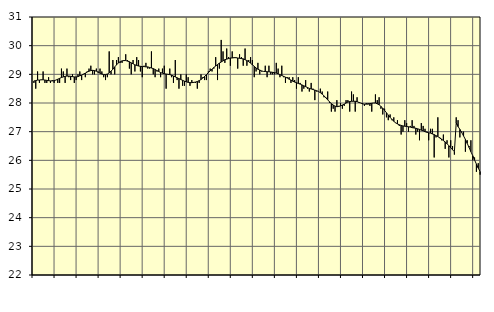
| Category | Piggar | Series 1 |
|---|---|---|
| nan | 28.7 | 28.77 |
| 1.0 | 28.5 | 28.78 |
| 1.0 | 29.1 | 28.8 |
| 1.0 | 28.7 | 28.8 |
| 1.0 | 28.8 | 28.81 |
| 1.0 | 29.1 | 28.81 |
| 1.0 | 28.7 | 28.8 |
| 1.0 | 28.7 | 28.79 |
| 1.0 | 28.9 | 28.78 |
| 1.0 | 28.7 | 28.77 |
| 1.0 | 28.8 | 28.77 |
| 1.0 | 28.7 | 28.78 |
| nan | 28.8 | 28.8 |
| 2.0 | 28.7 | 28.83 |
| 2.0 | 28.7 | 28.86 |
| 2.0 | 29.2 | 28.89 |
| 2.0 | 29.1 | 28.91 |
| 2.0 | 28.7 | 28.93 |
| 2.0 | 29.2 | 28.94 |
| 2.0 | 28.9 | 28.94 |
| 2.0 | 28.8 | 28.93 |
| 2.0 | 29 | 28.92 |
| 2.0 | 28.7 | 28.91 |
| 2.0 | 28.8 | 28.91 |
| nan | 29 | 28.92 |
| 3.0 | 29.1 | 28.95 |
| 3.0 | 28.8 | 28.97 |
| 3.0 | 29 | 29.01 |
| 3.0 | 28.9 | 29.04 |
| 3.0 | 29.1 | 29.08 |
| 3.0 | 29.2 | 29.11 |
| 3.0 | 29.3 | 29.13 |
| 3.0 | 29 | 29.14 |
| 3.0 | 29 | 29.13 |
| 3.0 | 29.2 | 29.11 |
| 3.0 | 29.1 | 29.07 |
| nan | 29.2 | 29.04 |
| 4.0 | 29.1 | 29.01 |
| 4.0 | 28.9 | 28.99 |
| 4.0 | 28.8 | 28.99 |
| 4.0 | 28.9 | 29.01 |
| 4.0 | 29.8 | 29.05 |
| 4.0 | 29 | 29.11 |
| 4.0 | 29.5 | 29.18 |
| 4.0 | 29 | 29.26 |
| 4.0 | 29.5 | 29.33 |
| 4.0 | 29.6 | 29.4 |
| 4.0 | 29.4 | 29.44 |
| nan | 29.4 | 29.47 |
| 5.0 | 29.5 | 29.48 |
| 5.0 | 29.7 | 29.48 |
| 5.0 | 29.5 | 29.46 |
| 5.0 | 29.2 | 29.44 |
| 5.0 | 29 | 29.4 |
| 5.0 | 29.5 | 29.37 |
| 5.0 | 29.1 | 29.33 |
| 5.0 | 29.6 | 29.31 |
| 5.0 | 29.5 | 29.29 |
| 5.0 | 29.1 | 29.28 |
| 5.0 | 28.9 | 29.27 |
| nan | 29.3 | 29.27 |
| 6.0 | 29.4 | 29.26 |
| 6.0 | 29.2 | 29.26 |
| 6.0 | 29.2 | 29.24 |
| 6.0 | 29.8 | 29.22 |
| 6.0 | 29 | 29.2 |
| 6.0 | 28.9 | 29.17 |
| 6.0 | 29.1 | 29.13 |
| 6.0 | 29.2 | 29.1 |
| 6.0 | 28.9 | 29.06 |
| 6.0 | 29.2 | 29.04 |
| 6.0 | 29.3 | 29.02 |
| nan | 28.5 | 29.01 |
| 7.0 | 29 | 29 |
| 7.0 | 29.2 | 28.99 |
| 7.0 | 28.9 | 28.97 |
| 7.0 | 28.7 | 28.94 |
| 7.0 | 29.5 | 28.91 |
| 7.0 | 28.8 | 28.88 |
| 7.0 | 28.5 | 28.85 |
| 7.0 | 29 | 28.82 |
| 7.0 | 28.6 | 28.79 |
| 7.0 | 28.6 | 28.76 |
| 7.0 | 29 | 28.74 |
| nan | 28.9 | 28.72 |
| 8.0 | 28.6 | 28.71 |
| 8.0 | 28.8 | 28.71 |
| 8.0 | 28.7 | 28.72 |
| 8.0 | 28.7 | 28.73 |
| 8.0 | 28.5 | 28.75 |
| 8.0 | 28.7 | 28.78 |
| 8.0 | 29 | 28.82 |
| 8.0 | 28.9 | 28.87 |
| 8.0 | 28.8 | 28.93 |
| 8.0 | 28.8 | 28.99 |
| 8.0 | 29.1 | 29.06 |
| nan | 29.2 | 29.12 |
| 9.0 | 29.1 | 29.18 |
| 9.0 | 29.2 | 29.24 |
| 9.0 | 29.6 | 29.29 |
| 9.0 | 28.8 | 29.34 |
| 9.0 | 29.2 | 29.39 |
| 9.0 | 30.2 | 29.43 |
| 9.0 | 29.8 | 29.47 |
| 9.0 | 29.4 | 29.51 |
| 9.0 | 29.9 | 29.53 |
| 9.0 | 29.6 | 29.55 |
| 9.0 | 29.3 | 29.57 |
| nan | 29.8 | 29.57 |
| 10.0 | 29.6 | 29.58 |
| 10.0 | 29.6 | 29.58 |
| 10.0 | 29.2 | 29.57 |
| 10.0 | 29.7 | 29.56 |
| 10.0 | 29.6 | 29.55 |
| 10.0 | 29.3 | 29.54 |
| 10.0 | 29.9 | 29.51 |
| 10.0 | 29.3 | 29.48 |
| 10.0 | 29.5 | 29.44 |
| 10.0 | 29.6 | 29.39 |
| 10.0 | 29.5 | 29.33 |
| nan | 28.9 | 29.28 |
| 11.0 | 29.1 | 29.22 |
| 11.0 | 29.4 | 29.18 |
| 11.0 | 29 | 29.15 |
| 11.0 | 29.1 | 29.12 |
| 11.0 | 29.1 | 29.1 |
| 11.0 | 29.3 | 29.1 |
| 11.0 | 28.9 | 29.09 |
| 11.0 | 29.3 | 29.09 |
| 11.0 | 29 | 29.08 |
| 11.0 | 29 | 29.07 |
| 11.0 | 29 | 29.06 |
| nan | 29.4 | 29.04 |
| 12.0 | 29.2 | 29.02 |
| 12.0 | 28.9 | 28.99 |
| 12.0 | 29.3 | 28.96 |
| 12.0 | 28.9 | 28.93 |
| 12.0 | 28.7 | 28.9 |
| 12.0 | 28.9 | 28.87 |
| 12.0 | 28.9 | 28.83 |
| 12.0 | 28.7 | 28.8 |
| 12.0 | 28.9 | 28.76 |
| 12.0 | 28.8 | 28.73 |
| 12.0 | 28.5 | 28.71 |
| nan | 28.9 | 28.68 |
| 13.0 | 28.7 | 28.66 |
| 13.0 | 28.4 | 28.63 |
| 13.0 | 28.5 | 28.6 |
| 13.0 | 28.8 | 28.57 |
| 13.0 | 28.5 | 28.54 |
| 13.0 | 28.4 | 28.51 |
| 13.0 | 28.7 | 28.49 |
| 13.0 | 28.5 | 28.47 |
| 13.0 | 28.1 | 28.45 |
| 13.0 | 28.4 | 28.43 |
| 13.0 | 28.4 | 28.4 |
| nan | 28.5 | 28.36 |
| 14.0 | 28.4 | 28.31 |
| 14.0 | 28.2 | 28.25 |
| 14.0 | 28.2 | 28.18 |
| 14.0 | 28.4 | 28.11 |
| 14.0 | 28 | 28.04 |
| 14.0 | 27.7 | 27.98 |
| 14.0 | 27.8 | 27.93 |
| 14.0 | 27.7 | 27.89 |
| 14.0 | 28.1 | 27.87 |
| 14.0 | 27.9 | 27.88 |
| 14.0 | 28 | 27.9 |
| nan | 27.8 | 27.93 |
| 15.0 | 27.9 | 27.96 |
| 15.0 | 28.1 | 28 |
| 15.0 | 28.1 | 28.03 |
| 15.0 | 27.7 | 28.05 |
| 15.0 | 28.4 | 28.06 |
| 15.0 | 28.3 | 28.06 |
| 15.0 | 27.7 | 28.06 |
| 15.0 | 28.2 | 28.05 |
| 15.0 | 28 | 28.02 |
| 15.0 | 28 | 28 |
| 15.0 | 28 | 27.97 |
| nan | 27.9 | 27.96 |
| 16.0 | 28 | 27.96 |
| 16.0 | 28 | 27.96 |
| 16.0 | 27.9 | 27.98 |
| 16.0 | 27.7 | 27.99 |
| 16.0 | 28 | 28 |
| 16.0 | 28.3 | 28 |
| 16.0 | 28.1 | 27.97 |
| 16.0 | 28.2 | 27.94 |
| 16.0 | 27.8 | 27.88 |
| 16.0 | 27.6 | 27.82 |
| 16.0 | 27.8 | 27.74 |
| nan | 27.5 | 27.66 |
| 17.0 | 27.4 | 27.58 |
| 17.0 | 27.6 | 27.5 |
| 17.0 | 27.4 | 27.43 |
| 17.0 | 27.5 | 27.36 |
| 17.0 | 27.3 | 27.31 |
| 17.0 | 27.4 | 27.27 |
| 17.0 | 27.2 | 27.24 |
| 17.0 | 26.9 | 27.22 |
| 17.0 | 27 | 27.2 |
| 17.0 | 27.4 | 27.19 |
| 17.0 | 27.3 | 27.18 |
| nan | 27 | 27.17 |
| 18.0 | 27.2 | 27.16 |
| 18.0 | 27.4 | 27.14 |
| 18.0 | 27.2 | 27.13 |
| 18.0 | 26.9 | 27.12 |
| 18.0 | 27 | 27.1 |
| 18.0 | 26.7 | 27.08 |
| 18.0 | 27.3 | 27.05 |
| 18.0 | 27.2 | 27.03 |
| 18.0 | 27.1 | 27 |
| 18.0 | 27 | 26.98 |
| 18.0 | 26.7 | 26.96 |
| nan | 27.1 | 26.95 |
| 19.0 | 27.1 | 26.92 |
| 19.0 | 26.1 | 26.9 |
| 19.0 | 26.8 | 26.86 |
| 19.0 | 27.5 | 26.83 |
| 19.0 | 26.8 | 26.78 |
| 19.0 | 26.7 | 26.74 |
| 19.0 | 26.9 | 26.69 |
| 19.0 | 26.4 | 26.64 |
| 19.0 | 26.7 | 26.58 |
| 19.0 | 26.1 | 26.51 |
| 19.0 | 26.7 | 26.44 |
| nan | 26.5 | 26.37 |
| 20.0 | 26.2 | 26.3 |
| 20.0 | 27.5 | 27.31 |
| 20.0 | 27.4 | 27.18 |
| 20.0 | 26.8 | 27.08 |
| 20.0 | 27 | 26.97 |
| 20.0 | 27 | 26.85 |
| 20.0 | 26.3 | 26.73 |
| 20.0 | 26.7 | 26.59 |
| 20.0 | 26.5 | 26.45 |
| 20.0 | 26.7 | 26.3 |
| 20.0 | 26 | 26.16 |
| nan | 26.1 | 26.01 |
| 21.0 | 25.6 | 25.87 |
| 21.0 | 25.9 | 25.73 |
| 21.0 | 25.5 | 25.61 |